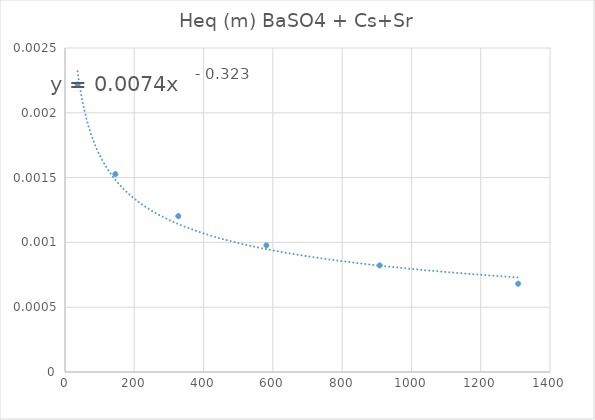
| Category | Heq (m) BaSO4 |
|---|---|
| 36.335 | 0.002 |
| 145.34 | 0.002 |
| 327.01500000000004 | 0.001 |
| 581.36 | 0.001 |
| 908.3750000000001 | 0.001 |
| 1308.0600000000002 | 0.001 |